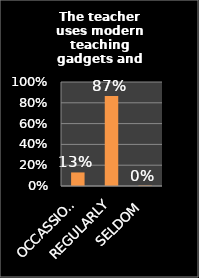
| Category | Series 0 |
|---|---|
| OCCASSIONALLY | 0.13 |
| REGULARLY | 0.866 |
| SELDOM | 0.005 |